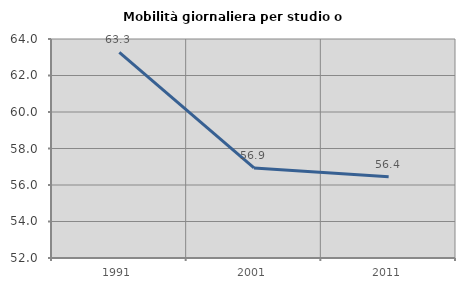
| Category | Mobilità giornaliera per studio o lavoro |
|---|---|
| 1991.0 | 63.264 |
| 2001.0 | 56.934 |
| 2011.0 | 56.448 |